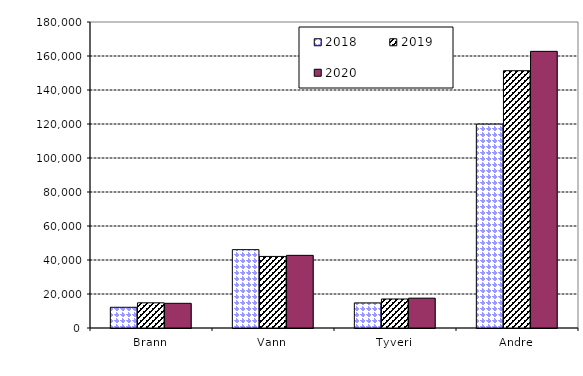
| Category | 2018 | 2019 | 2020 |
|---|---|---|---|
| Brann | 12186.599 | 14807.767 | 14515.715 |
| Vann | 46084.437 | 42098.168 | 42736.006 |
| Tyveri | 14752.684 | 17067.714 | 17552.031 |
| Andre | 119937.321 | 151351.72 | 162737.467 |